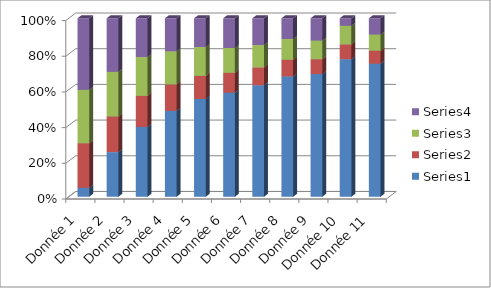
| Category | Series 0 | Series 1 | Series 2 | Series 3 |
|---|---|---|---|---|
| Donnée 1 | 1 | 5 | 6 | 8 |
| Donnée 2 | 5 | 4 | 5 | 6 |
| Donnée 3 | 9 | 4 | 5 | 5 |
| Donnée 4 | 13 | 4 | 5 | 5 |
| Donnée 5 | 17 | 4 | 5 | 5 |
| Donnée 6 | 21 | 4 | 5 | 6 |
| Donnée 7 | 25 | 4 | 5 | 6 |
| Donnée 8 | 29 | 4 | 5 | 5 |
| Donnée 9 | 33 | 4 | 5 | 6 |
| Donnée 10 | 37 | 4 | 5 | 2 |
| Donnée 11 | 41 | 4 | 5 | 5 |